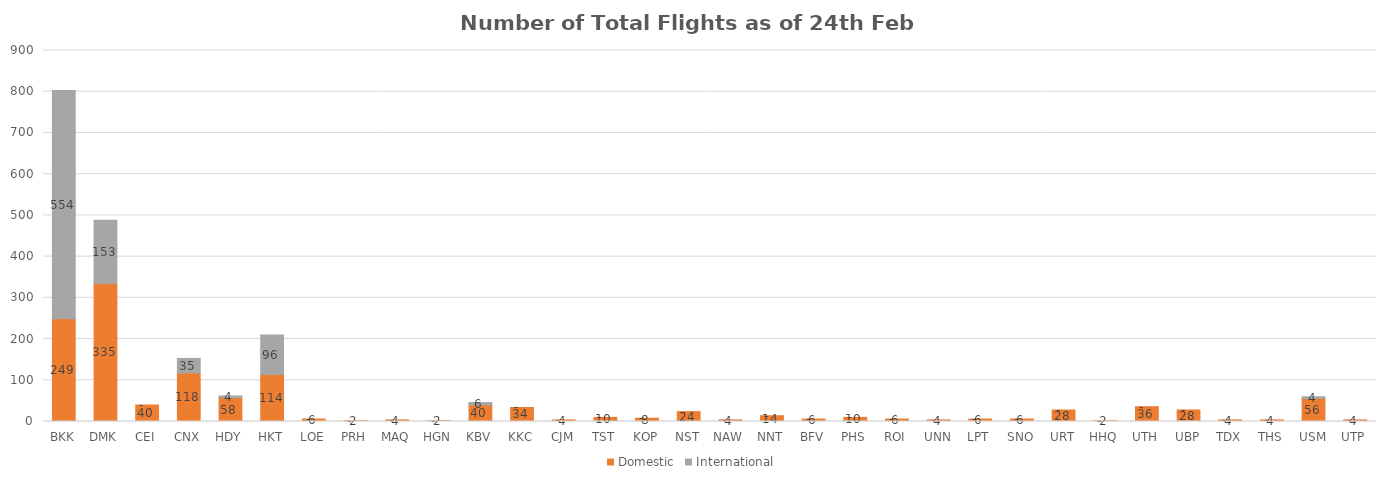
| Category | Domestic | International |
|---|---|---|
| BKK | 249 | 554 |
| DMK | 335 | 153 |
| CEI | 40 | 0 |
| CNX | 118 | 35 |
| HDY | 58 | 4 |
| HKT | 114 | 96 |
| LOE | 6 | 0 |
| PRH | 2 | 0 |
| MAQ | 4 | 0 |
| HGN | 2 | 0 |
| KBV | 40 | 6 |
| KKC | 34 | 0 |
| CJM | 4 | 0 |
| TST | 10 | 0 |
| KOP | 8 | 0 |
| NST | 24 | 0 |
| NAW | 4 | 0 |
| NNT | 14 | 0 |
| BFV | 6 | 0 |
| PHS | 10 | 0 |
| ROI | 6 | 0 |
| UNN | 4 | 0 |
| LPT | 6 | 0 |
| SNO | 6 | 0 |
| URT | 28 | 0 |
| HHQ | 2 | 0 |
| UTH | 36 | 0 |
| UBP | 28 | 0 |
| TDX | 4 | 0 |
| THS | 4 | 0 |
| USM | 56 | 4 |
| UTP | 4 | 0 |